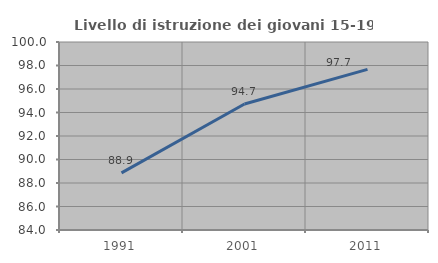
| Category | Livello di istruzione dei giovani 15-19 anni |
|---|---|
| 1991.0 | 88.865 |
| 2001.0 | 94.726 |
| 2011.0 | 97.674 |